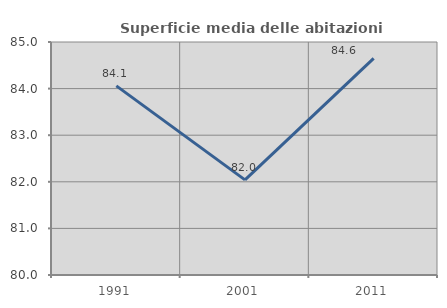
| Category | Superficie media delle abitazioni occupate |
|---|---|
| 1991.0 | 84.059 |
| 2001.0 | 82.041 |
| 2011.0 | 84.648 |